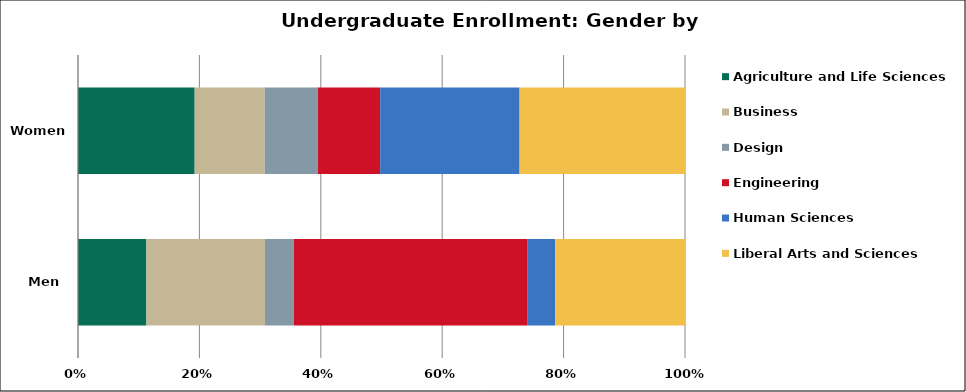
| Category | Agriculture and Life Sciences | Business | Design | Engineering | Human Sciences | Liberal Arts and Sciences |
|---|---|---|---|---|---|---|
| Men | 1710 | 2963 | 723 | 5830 | 705 | 3241 |
| Women | 2244 | 1345 | 1023 | 1199 | 2682 | 3181 |